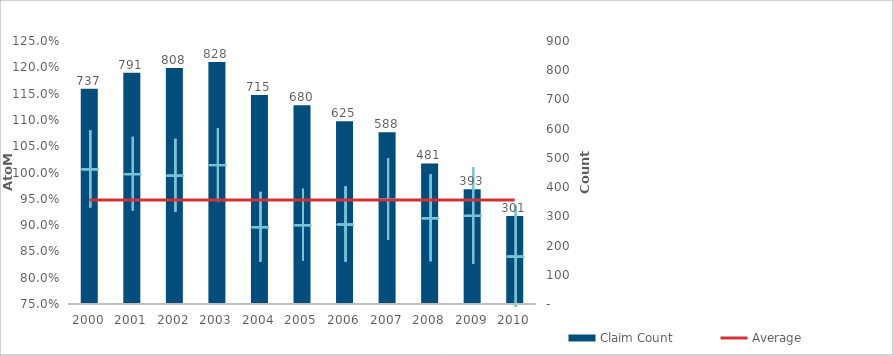
| Category | Claim Count |
|---|---|
| 0 | 737 |
| 1 | 791 |
| 2 | 808 |
| 3 | 828 |
| 4 | 715 |
| 5 | 680 |
| 6 | 625 |
| 7 | 588 |
| 8 | 481 |
| 9 | 393 |
| 10 | 301 |